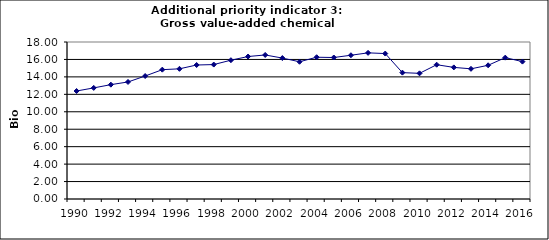
| Category | Gross value-added chemical industry, Bio Euro (EC95) |
|---|---|
| 1990 | 12.381 |
| 1991 | 12.738 |
| 1992 | 13.11 |
| 1993 | 13.418 |
| 1994 | 14.099 |
| 1995 | 14.828 |
| 1996 | 14.925 |
| 1997 | 15.363 |
| 1998 | 15.412 |
| 1999 | 15.914 |
| 2000 | 16.335 |
| 2001 | 16.513 |
| 2002 | 16.157 |
| 2003 | 15.736 |
| 2004 | 16.254 |
| 2005 | 16.222 |
| 2006 | 16.481 |
| 2007 | 16.757 |
| 2008 | 16.676 |
| 2009 | 14.488 |
| 2010 | 14.407 |
| 2011 | 15.395 |
| 2012 | 15.087 |
| 2013 | 14.925 |
| 2014 | 15.33 |
| 2015 | 16.206 |
| 2016 | 15.752 |